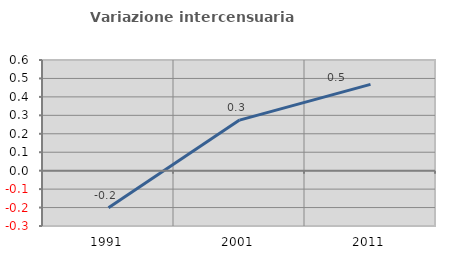
| Category | Variazione intercensuaria annua |
|---|---|
| 1991.0 | -0.201 |
| 2001.0 | 0.274 |
| 2011.0 | 0.468 |